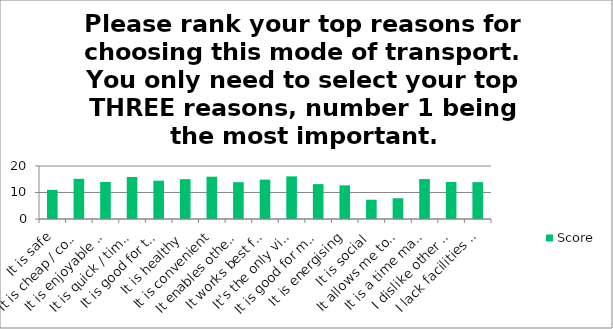
| Category | Score |
|---|---|
| It is safe | 11 |
| It is cheap / cost effective | 15.16 |
| It is enjoyable / fun | 13.98 |
| It is quick / time effective | 15.86 |
| It is good for the environment | 14.46 |
| It is healthy | 15.04 |
| It is convenient | 15.97 |
| It enables other things to be done on the commute | 13.89 |
| It works best for the transport needs of my household | 14.87 |
| It's the only viable option | 16.09 |
| It is good for my mental wellbeing | 13.17 |
| It is energising | 12.7 |
| It is social | 7.27 |
| It allows me to explore my surroundings | 7.83 |
| It is a time management strategy | 15.08 |
| I dislike other modes of transport | 13.98 |
| I lack facilities for other modes of transport | 13.91 |